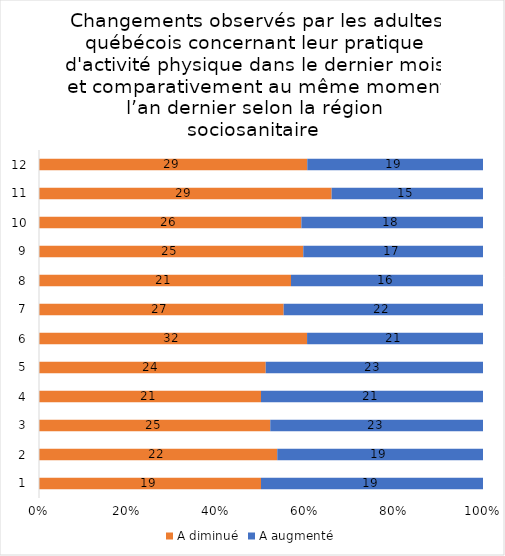
| Category | A diminué | A augmenté |
|---|---|---|
| 0 | 19 | 19 |
| 1 | 22 | 19 |
| 2 | 25 | 23 |
| 3 | 21 | 21 |
| 4 | 24 | 23 |
| 5 | 32 | 21 |
| 6 | 27 | 22 |
| 7 | 21 | 16 |
| 8 | 25 | 17 |
| 9 | 26 | 18 |
| 10 | 29 | 15 |
| 11 | 29 | 19 |